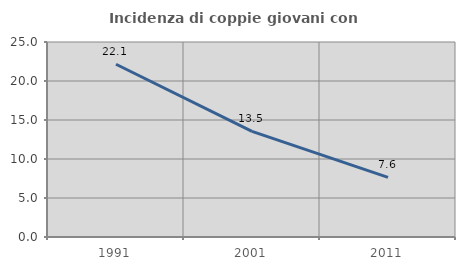
| Category | Incidenza di coppie giovani con figli |
|---|---|
| 1991.0 | 22.15 |
| 2001.0 | 13.538 |
| 2011.0 | 7.649 |